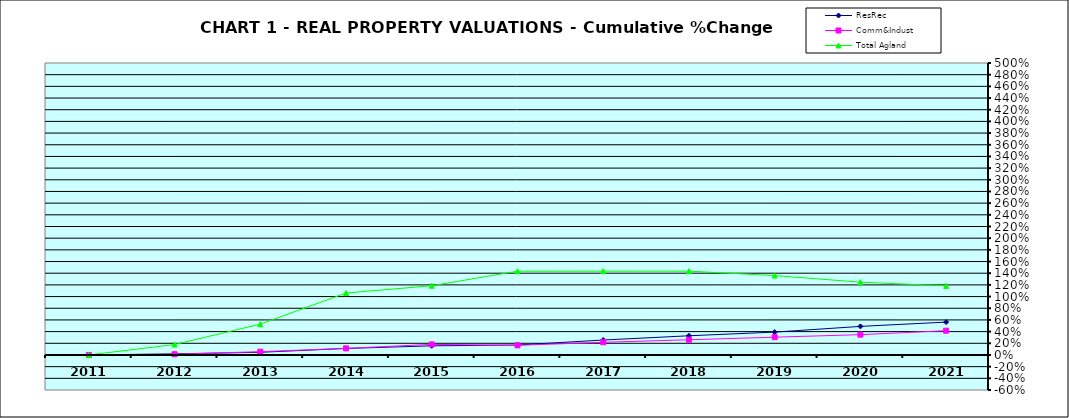
| Category | ResRec | Comm&Indust | Total Agland |
|---|---|---|---|
| 2011.0 | 0 | 0 | 0 |
| 2012.0 | 0.019 | 0.012 | 0.179 |
| 2013.0 | 0.046 | 0.056 | 0.527 |
| 2014.0 | 0.111 | 0.113 | 1.061 |
| 2015.0 | 0.157 | 0.181 | 1.186 |
| 2016.0 | 0.17 | 0.165 | 1.435 |
| 2017.0 | 0.256 | 0.217 | 1.436 |
| 2018.0 | 0.329 | 0.26 | 1.435 |
| 2019.0 | 0.391 | 0.304 | 1.36 |
| 2020.0 | 0.489 | 0.348 | 1.247 |
| 2021.0 | 0.563 | 0.416 | 1.183 |